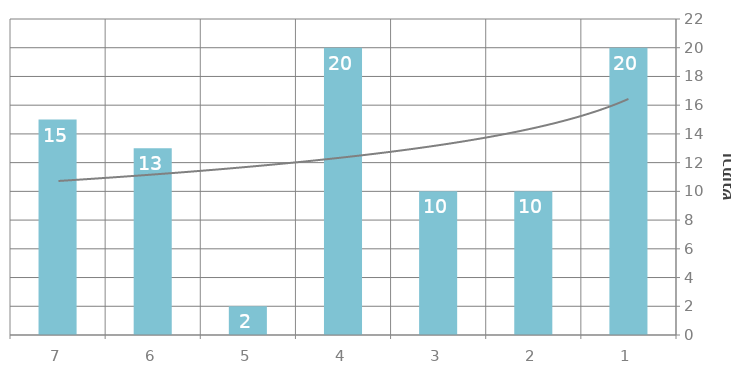
| Category | סה"כ |
|---|---|
| 1 | 20 |
| 2 | 10 |
| 3 | 10 |
| 4 | 20 |
| 5 | 2 |
| 6 | 13 |
| 7 | 15 |